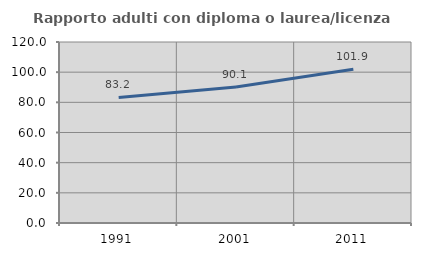
| Category | Rapporto adulti con diploma o laurea/licenza media  |
|---|---|
| 1991.0 | 83.212 |
| 2001.0 | 90.104 |
| 2011.0 | 101.942 |